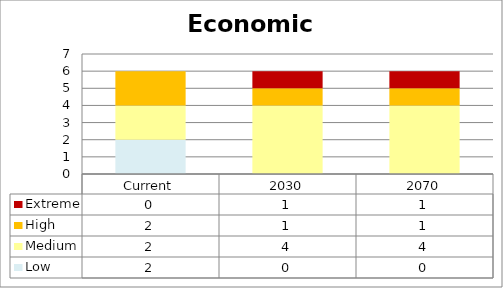
| Category | Low | Medium | High | Extreme |
|---|---|---|---|---|
| Current | 2 | 2 | 2 | 0 |
| 2030 | 0 | 4 | 1 | 1 |
| 2070 | 0 | 4 | 1 | 1 |